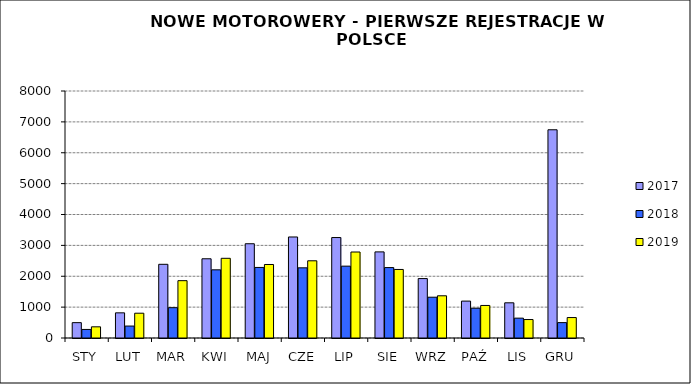
| Category | 2017 | 2018 | 2019 |
|---|---|---|---|
|  STY  | 497 | 277 | 362 |
|  LUT  | 815 | 387 | 803 |
| MAR | 2387 | 982 | 1857 |
| KWI | 2566 | 2208 | 2581 |
| MAJ | 3053 | 2285 | 2381 |
| CZE | 3272 | 2273 | 2501 |
| LIP | 3254 | 2327 | 2785 |
| SIE | 2789 | 2281 | 2220 |
| WRZ | 1925 | 1321 | 1367 |
| PAŹ | 1195 | 965 | 1054 |
| LIS | 1140 | 643 | 598 |
| GRU | 6744 | 498 | 662 |